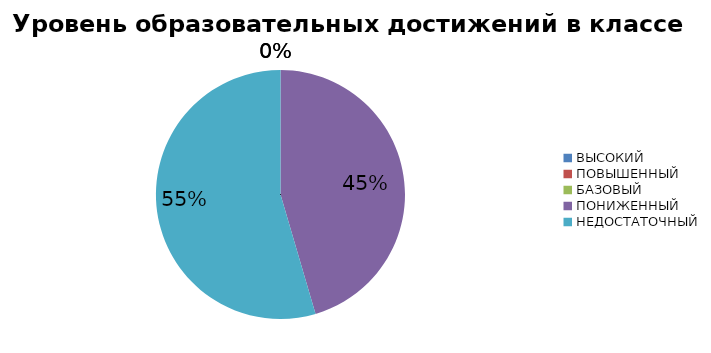
| Category | Series 0 |
|---|---|
| ВЫСОКИЙ | 0 |
| ПОВЫШЕННЫЙ | 0 |
| БАЗОВЫЙ | 0 |
| ПОНИЖЕННЫЙ | 75 |
| НЕДОСТАТОЧНЫЙ | 90 |